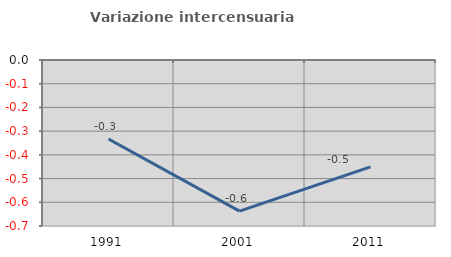
| Category | Variazione intercensuaria annua |
|---|---|
| 1991.0 | -0.333 |
| 2001.0 | -0.637 |
| 2011.0 | -0.451 |